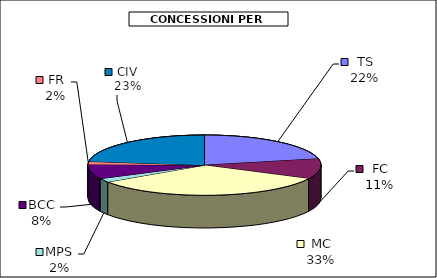
| Category | Series 0 |
|---|---|
| TS | 38256.75 |
| FC | 19087.25 |
| MC | 58633 |
| MPS | 3595 |
| BCC | 13762 |
| FR | 2800 |
| CIV | 40672.35 |